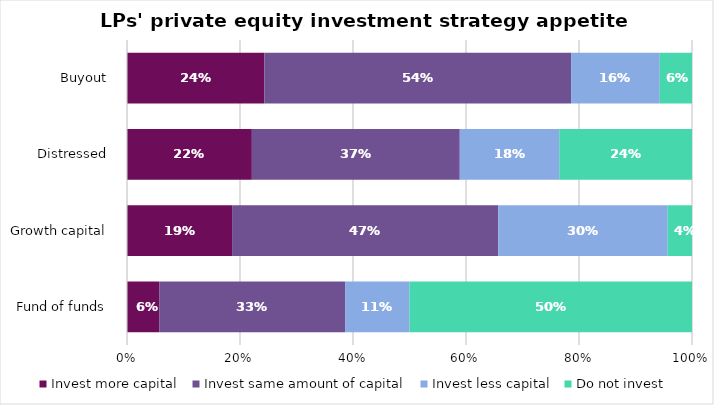
| Category | Invest more capital  | Invest same amount of capital  | Invest less capital  | Do not invest  |
|---|---|---|---|---|
| Fund of funds  | 0.057 | 0.329 | 0.114 | 0.5 |
| Growth capital  | 0.186 | 0.471 | 0.3 | 0.043 |
| Distressed  | 0.221 | 0.368 | 0.176 | 0.235 |
| Buyout  | 0.243 | 0.543 | 0.157 | 0.057 |